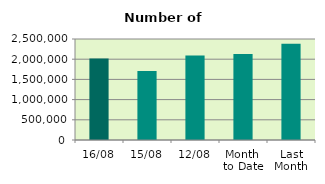
| Category | Series 0 |
|---|---|
| 16/08 | 2016560 |
| 15/08 | 1708130 |
| 12/08 | 2094642 |
| Month 
to Date | 2129279 |
| Last
Month | 2380266.19 |